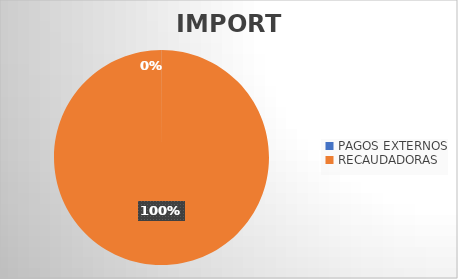
| Category | IMPORTE |
|---|---|
| PAGOS EXTERNOS | 404637.82 |
| RECAUDADORAS | 1421968087.55 |